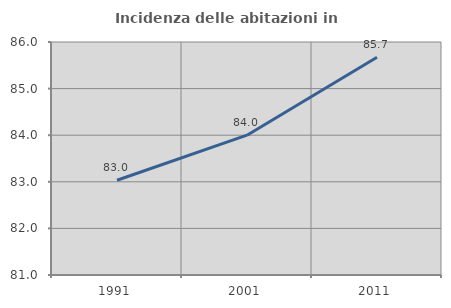
| Category | Incidenza delle abitazioni in proprietà  |
|---|---|
| 1991.0 | 83.034 |
| 2001.0 | 84 |
| 2011.0 | 85.673 |